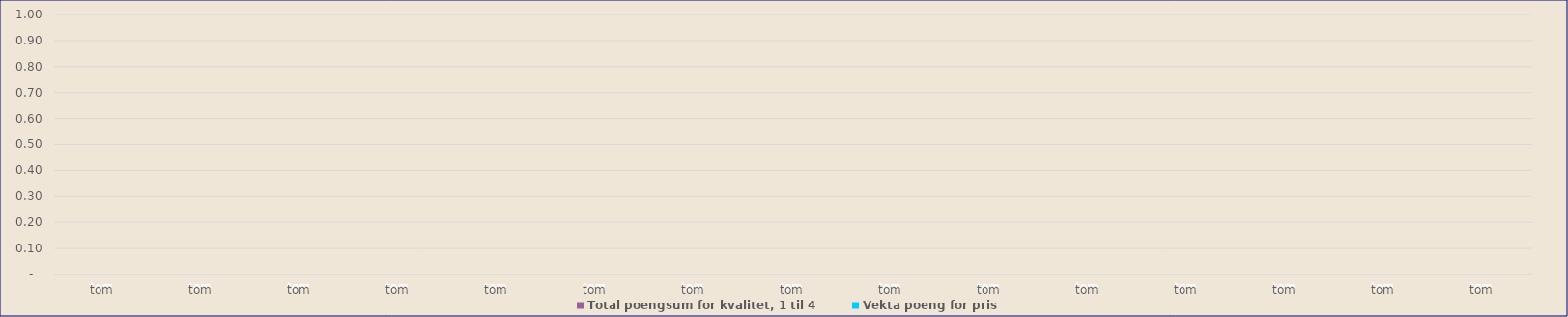
| Category | Vekta poeng for pris | Total poengsum for kvalitet, 1 til 4 |
|---|---|---|
|  tom  | 0 | 0 |
|  tom  | 0 | 0 |
|  tom  | 0 | 0 |
|  tom  | 0 | 0 |
|  tom  | 0 | 0 |
|  tom  | 0 | 0 |
|  tom  | 0 | 0 |
|  tom  | 0 | 0 |
|  tom  | 0 | 0 |
|  tom  | 0 | 0 |
|  tom  | 0 | 0 |
|  tom  | 0 | 0 |
|  tom  | 0 | 0 |
|  tom  | 0 | 0 |
|  tom  | 0 | 0 |